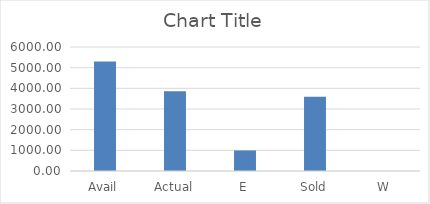
| Category | Series 0 |
|---|---|
| Avail | 5296.4 |
| Actual | 3856.66 |
| E | 993.98 |
| Sold | 3595.02 |
| W | 0 |